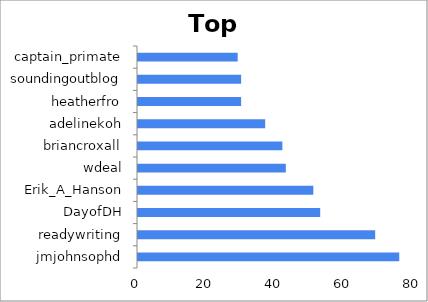
| Category | Series 0 |
|---|---|
| jmjohnsophd | 76 |
| readywriting | 69 |
| DayofDH | 53 |
| Erik_A_Hanson | 51 |
| wdeal | 43 |
| briancroxall | 42 |
| adelinekoh | 37 |
| heatherfro | 30 |
| soundingoutblog | 30 |
| captain_primate | 29 |